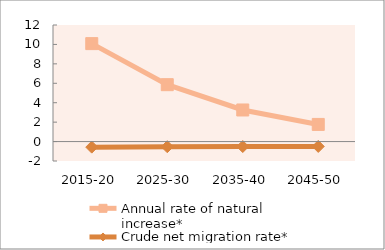
| Category | Annual rate of natural increase* | Crude net migration rate* |
|---|---|---|
| 2015-20 | 10.083 | -0.572 |
| 2025-30 | 5.856 | -0.531 |
| 2035-40 | 3.252 | -0.511 |
| 2045-50 | 1.764 | -0.501 |